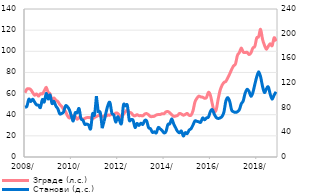
| Category | Зграде (л.с.) |
|---|---|
| 2008-01-01 | 60.827 |
| 2008-02-01 | 64.213 |
| 2008-03-01 | 64.63 |
| 2008-04-01 | 63.749 |
| 2008-05-01 | 60.985 |
| 2008-06-01 | 58.452 |
| 2008-07-01 | 59.692 |
| 2008-08-01 | 57.551 |
| 2008-09-01 | 59.847 |
| 2008-10-01 | 59.735 |
| 2008-11-01 | 62.529 |
| 2008-12-01 | 65.906 |
| 2009-01-01 | 61.27 |
| 2009-02-01 | 59.826 |
| 2009-03-01 | 53.757 |
| 2009-04-01 | 55.875 |
| 2009-05-01 | 53.679 |
| 2009-06-01 | 52.539 |
| 2009-07-01 | 49.752 |
| 2009-08-01 | 47.793 |
| 2009-09-01 | 45.103 |
| 2009-10-01 | 43.137 |
| 2009-11-01 | 39.04 |
| 2009-12-01 | 36.799 |
| 2010-01-01 | 39.529 |
| 2010-02-01 | 38.148 |
| 2010-03-01 | 38.701 |
| 2010-04-01 | 35.68 |
| 2010-05-01 | 37.346 |
| 2010-06-01 | 36.717 |
| 2010-07-01 | 35.681 |
| 2010-08-01 | 36.539 |
| 2010-09-01 | 37.238 |
| 2010-10-01 | 37.284 |
| 2010-11-01 | 37.111 |
| 2010-12-01 | 36.144 |
| 2011-01-01 | 37.407 |
| 2011-02-01 | 38.34 |
| 2011-03-01 | 39.196 |
| 2011-04-01 | 38.85 |
| 2011-05-01 | 38.212 |
| 2011-06-01 | 38.927 |
| 2011-07-01 | 38.708 |
| 2011-08-01 | 39.656 |
| 2011-09-01 | 39.599 |
| 2011-10-01 | 40.677 |
| 2011-11-01 | 40.124 |
| 2011-12-01 | 41.542 |
| 2012-01-01 | 41.295 |
| 2012-02-01 | 39.201 |
| 2012-03-01 | 37.735 |
| 2012-04-01 | 40.514 |
| 2012-05-01 | 42.807 |
| 2012-06-01 | 44.507 |
| 2012-07-01 | 42.45 |
| 2012-08-01 | 41.701 |
| 2012-09-01 | 39.553 |
| 2012-10-01 | 38.913 |
| 2012-11-01 | 40.056 |
| 2012-12-01 | 39.134 |
| 2013-01-01 | 39.165 |
| 2013-02-01 | 38.957 |
| 2013-03-01 | 40.623 |
| 2013-04-01 | 41.062 |
| 2013-05-01 | 39.968 |
| 2013-06-01 | 38.256 |
| 2013-07-01 | 38.298 |
| 2013-08-01 | 38.575 |
| 2013-09-01 | 39.757 |
| 2013-10-01 | 40.175 |
| 2013-11-01 | 40.227 |
| 2013-12-01 | 40.945 |
| 2014-01-01 | 40.898 |
| 2014-02-01 | 42.645 |
| 2014-03-01 | 42.996 |
| 2014-04-01 | 41.811 |
| 2014-05-01 | 40.075 |
| 2014-06-01 | 38.472 |
| 2014-07-01 | 38.692 |
| 2014-08-01 | 39.353 |
| 2014-09-01 | 41.169 |
| 2014-10-01 | 40.621 |
| 2014-11-01 | 39.514 |
| 2014-12-01 | 40.266 |
| 2015-01-01 | 41.249 |
| 2015-02-01 | 39.41 |
| 2015-03-01 | 39.548 |
| 2015-04-01 | 43.663 |
| 2015-05-01 | 51.971 |
| 2015-06-01 | 55.475 |
| 2015-07-01 | 57.568 |
| 2015-08-01 | 56.885 |
| 2015-09-01 | 56.555 |
| 2015-10-01 | 55.554 |
| 2015-11-01 | 56.273 |
| 2015-12-01 | 61.196 |
| 2016-01-01 | 58.484 |
| 2016-02-01 | 50.29 |
| 2016-03-01 | 43.223 |
| 2016-04-01 | 44.551 |
| 2016-05-01 | 54.341 |
| 2016-06-01 | 62.79 |
| 2016-07-01 | 67.634 |
| 2016-08-01 | 70.483 |
| 2016-09-01 | 71.506 |
| 2016-10-01 | 74.925 |
| 2016-11-01 | 78.613 |
| 2016-12-01 | 82.751 |
| 2017-01-01 | 86.185 |
| 2017-02-01 | 88.058 |
| 2017-03-01 | 96.059 |
| 2017-04-01 | 98.784 |
| 2017-05-01 | 103.155 |
| 2017-06-01 | 99.273 |
| 2017-07-01 | 98.74 |
| 2017-08-01 | 99.081 |
| 2017-09-01 | 96.947 |
| 2017-10-01 | 98.424 |
| 2017-11-01 | 103.118 |
| 2017-12-01 | 104.591 |
| 2018-01-01 | 112.587 |
| 2018-02-01 | 113.772 |
| 2018-03-01 | 120.754 |
| 2018-04-01 | 111.42 |
| 2018-05-01 | 105.766 |
| 2018-06-01 | 101.943 |
| 2018-07-01 | 104.773 |
| 2018-08-01 | 107.137 |
| 2018-09-30 | 105.267 |
| 2018-10-31 | 112.84 |
| 2018-11-30 | 109.439 |